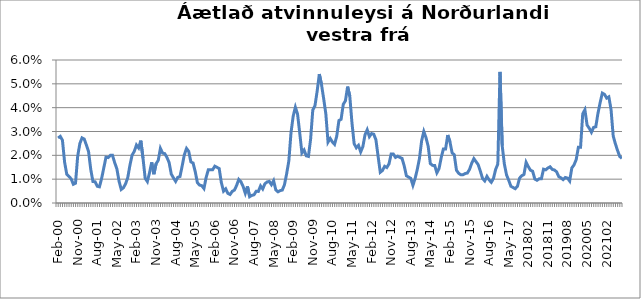
| Category | Series 0 |
|---|---|
| Feb-00 | 0.027 |
| Mar-00 | 0.028 |
| Apr-00 | 0.026 |
| May-00 | 0.017 |
| Jun-00 | 0.012 |
| Jul-00 | 0.011 |
| Aug-00 | 0.01 |
| Sep-00 | 0.008 |
| Oct-00 | 0.008 |
| Nov-00 | 0.02 |
| Dec-00 | 0.025 |
| Jan-01 | 0.027 |
| Feb-01 | 0.027 |
| Mar-01 | 0.024 |
| Apr-01 | 0.022 |
| May-01 | 0.014 |
| Jun-01 | 0.009 |
| Jul-01 | 0.009 |
| Aug-01 | 0.007 |
| Sep-01 | 0.007 |
| Oct-01 | 0.01 |
| Nov-01 | 0.015 |
| Dec-01 | 0.019 |
| Jan-02 | 0.019 |
| Feb-02 | 0.02 |
| Mar-02 | 0.02 |
| Apr-02 | 0.017 |
| May-02 | 0.014 |
| Jun-02 | 0.009 |
| Jul-02 | 0.006 |
| Aug-02 | 0.006 |
| Sep-02 | 0.008 |
| Oct-02 | 0.011 |
| Nov-02 | 0.016 |
| Dec-02 | 0.02 |
| Jan-03 | 0.022 |
| Feb-03 | 0.024 |
| Mar-03 | 0.023 |
| Apr-03 | 0.026 |
| May-03 | 0.019 |
| Jun-03 | 0.01 |
| Jul-03 | 0.009 |
| Aug-03 | 0.013 |
| Sep-03 | 0.017 |
| Oct-03 | 0.012 |
| Nov-03 | 0.016 |
| Dec-03 | 0.018 |
| Jan-04 | 0.023 |
| Feb-04 | 0.021 |
| Mar-04 | 0.021 |
| Apr-04 | 0.019 |
| May-04 | 0.017 |
| Jun-04 | 0.012 |
| Jul-04 | 0.011 |
| Aug-04 | 0.009 |
| Sep-04 | 0.011 |
| Oct-04 | 0.011 |
| Nov-04 | 0.016 |
| Dec-04 | 0.02 |
| Jan-05 | 0.023 |
| Feb-05 | 0.022 |
| Mar-05 | 0.017 |
| Apr-05 | 0.017 |
| May-05 | 0.013 |
| Jun-05 | 0.009 |
| Jul-05 | 0.008 |
| Aug-05 | 0.007 |
| Sep-05 | 0.006 |
| Oct-05 | 0.011 |
| Nov-05 | 0.014 |
| Dec-05 | 0.014 |
| Jan-06 | 0.014 |
| Feb-06 | 0.015 |
| Mar-06 | 0.015 |
| Apr-06 | 0.014 |
| May-06 | 0.009 |
| Jun-06 | 0.005 |
| Jul-06 | 0.006 |
| Aug-06 | 0.004 |
| Sep-06 | 0.004 |
| Oct-06 | 0.005 |
| Nov-06 | 0.005 |
| Dec-06 | 0.007 |
| Jan-07 | 0.01 |
| Feb-07 | 0.009 |
| Mar-07 | 0.007 |
| Apr-07 | 0.004 |
| May-07 | 0.007 |
| Jun-07 | 0.003 |
| Jul-07 | 0.003 |
| Aug-07 | 0.003 |
| Sep-07 | 0.005 |
| Oct-07 | 0.005 |
| Nov-07 | 0.007 |
| Dec-07 | 0.006 |
| Jan-08 | 0.008 |
| Feb-08 | 0.009 |
| Mar-08 | 0.009 |
| Apr-08 | 0.008 |
| May-08 | 0.009 |
| Jun-08 | 0.006 |
| Jul-08 | 0.005 |
| Aug-08 | 0.005 |
| Sep-08 | 0.005 |
| Oct-08 | 0.008 |
| Nov-08 | 0.012 |
| Dec-08 | 0.018 |
| Jan-09 | 0.03 |
| Feb-09 | 0.036 |
| Mar-09 | 0.04 |
| Apr-09 | 0.037 |
| May-09 | 0.029 |
| Jun-09 | 0.021 |
| Jul-09 | 0.022 |
| Aug-09 | 0.02 |
| Sep-09 | 0.02 |
| Oct-09 | 0.027 |
| Nov-09 | 0.039 |
| Dec-09 | 0.041 |
| Jan-10 | 0.047 |
| Feb-10 | 0.054 |
| Mar-10 | 0.05 |
| Apr-10 | 0.044 |
| May-10 | 0.037 |
| Jun-10 | 0.026 |
| Jul-10 | 0.027 |
| Aug-10 | 0.026 |
| Sep-10 | 0.025 |
| Oct-10 | 0.028 |
| Nov-10 | 0.035 |
| Dec-10 | 0.035 |
| Jan-11 | 0.041 |
| Feb-11 | 0.043 |
| Mar-11 | 0.049 |
| Apr-11 | 0.045 |
| May-11 | 0.034 |
| Jun-11 | 0.025 |
| Jul-11 | 0.023 |
| Aug-11 | 0.024 |
| Sep-11 | 0.021 |
| Oct-11 | 0.024 |
| Nov-11 | 0.029 |
| Dec-11 | 0.031 |
| Jan-12 | 0.028 |
| Feb-12 | 0.029 |
| Mar-12 | 0.029 |
| Apr-12 | 0.027 |
| May-12 | 0.02 |
| Jun-12 | 0.013 |
| Jul-12 | 0.014 |
| Aug-12 | 0.015 |
| Sep-12 | 0.015 |
| Oct-12 | 0.016 |
| Nov-12 | 0.021 |
| Dec-12 | 0.021 |
| Jan-13 | 0.019 |
| Feb-13 | 0.02 |
| Mar-13 | 0.019 |
| Apr-13 | 0.019 |
| May-13 | 0.016 |
| Jun-13 | 0.011 |
| Jul-13 | 0.011 |
| Aug-13 | 0.01 |
| Sep-13 | 0.007 |
| Oct-13 | 0.01 |
| Nov-13 | 0.014 |
| Dec-13 | 0.019 |
| jan.14* | 0.026 |
| Feb-14 | 0.03 |
| Mar-14 | 0.027 |
| Apr-14 | 0.024 |
| May-14 | 0.017 |
| Jun-14 | 0.016 |
| Jul-14 | 0.016 |
| Aug-14 | 0.013 |
| Sep-14 | 0.014 |
| Oct-14 | 0.019 |
| Nov-14 | 0.023 |
| Dec-14 | 0.023 |
| Jan-15 | 0.029 |
| Feb-15 | 0.026 |
| Mar-15 | 0.021 |
| Apr-15 | 0.02 |
| May-15 | 0.014 |
| Jun-15 | 0.012 |
| Jul-15 | 0.012 |
| Aug-15 | 0.012 |
| Sep-15 | 0.012 |
| Oct-15 | 0.013 |
| Nov-15 | 0.014 |
| Dec-15 | 0.017 |
| Jan-16 | 0.019 |
| Feb-16 | 0.017 |
| Mar-16 | 0.016 |
| Apr-16 | 0.013 |
| May-16 | 0.01 |
| Jun-16 | 0.009 |
| Jul-16 | 0.011 |
| Aug-16 | 0.01 |
| Sep-16 | 0.009 |
| Oct-16 | 0.01 |
| Nov-16 | 0.014 |
| Dec-16 | 0.016 |
| Jan-17 | 0.055 |
| Feb-17 | 0.024 |
| Mar-17 | 0.016 |
| Apr-17 | 0.012 |
| May-17 | 0.01 |
| Jun-17 | 0.007 |
| Jul-17 | 0.007 |
| Aug-17 | 0.006 |
| Sep-17 | 0.007 |
| 201710 | 0.01 |
| 201711 | 0.011 |
| 201712 | 0.012 |
| 201801 | 0.017 |
| 201802 | 0.015 |
| 201803 | 0.014 |
| 201804 | 0.013 |
| 201805 | 0.01 |
| 201806 | 0.01 |
| 201807 | 0.01 |
| 201808 | 0.01 |
| 201809 | 0.014 |
| 201810 | 0.014 |
| 201811 | 0.015 |
| 201812 | 0.015 |
| 201901 | 0.014 |
| 201902 | 0.014 |
| 201903 | 0.013 |
| 201904 | 0.011 |
| 201905 | 0.011 |
| 201906 | 0.01 |
| 201907 | 0.011 |
| 201908 | 0.01 |
| 201909 | 0.009 |
| 201910 | 0.015 |
| 201911 | 0.016 |
| 201912 | 0.018 |
| 202001 | 0.023 |
| 202002 | 0.023 |
| 202003 | 0.037 |
| 202004 | 0.039 |
| 202005 | 0.033 |
| 202006 | 0.031 |
| 202007 | 0.03 |
| 202008 | 0.032 |
| 202009 | 0.032 |
| 202010 | 0.038 |
| 202011 | 0.042 |
| 202012 | 0.046 |
| 202101 | 0.046 |
| 202102 | 0.044 |
| 202103 | 0.045 |
| 202104 | 0.039 |
| 202105 | 0.028 |
| 202106 | 0.025 |
| 202107 | 0.022 |
| 202108 | 0.02 |
| 202109 | 0.019 |